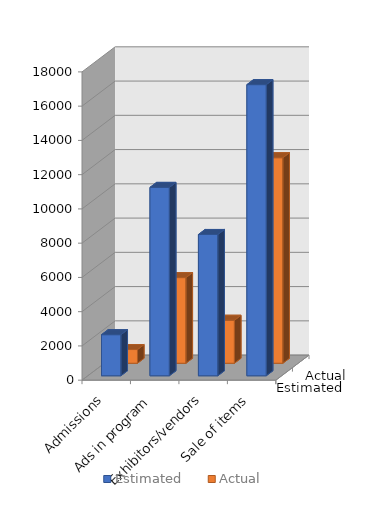
| Category | Estimated | Actual |
|---|---|---|
| Admissions | 2400 | 800 |
| Ads in program | 11000 | 5000 |
| Exhibitors/vendors | 8250 | 2510 |
| Sale of items | 17000 | 12000 |